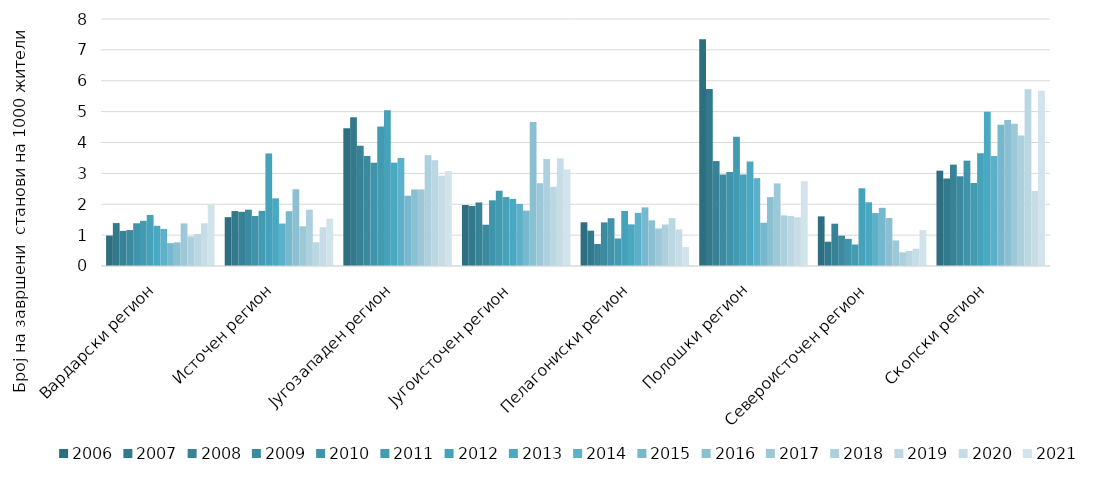
| Category | 2006 | 2007 | 2008 | 2009 | 2010 | 2011 | 2012 | 2013 | 2014 | 2015 | 2016 | 2017 | 2018 | 2019 | 2020 | 2021 |
|---|---|---|---|---|---|---|---|---|---|---|---|---|---|---|---|---|
| Вардарски регион | 0.986 | 1.39 | 1.137 | 1.164 | 1.384 | 1.463 | 1.654 | 1.304 | 1.2 | 0.739 | 0.767 | 1.379 | 0.96 | 1.036 | 1.384 | 1.982 |
| Источен регион | 1.582 | 1.779 | 1.755 | 1.824 | 1.619 | 1.787 | 3.646 | 2.191 | 1.375 | 1.775 | 2.485 | 1.287 | 1.824 | 0.771 | 1.254 | 1.531 |
| Југозападен регион | 4.461 | 4.815 | 3.895 | 3.565 | 3.345 | 4.516 | 5.044 | 3.347 | 3.499 | 2.276 | 2.48 | 2.481 | 3.589 | 3.426 | 2.925 | 3.072 |
| Југоисточен регион | 1.976 | 1.945 | 2.058 | 1.338 | 2.127 | 2.438 | 2.233 | 2.173 | 2.011 | 1.792 | 4.667 | 2.682 | 3.467 | 2.563 | 3.486 | 3.127 |
| Пелагониски регион | 1.416 | 1.144 | 0.712 | 1.413 | 1.547 | 0.892 | 1.784 | 1.348 | 1.719 | 1.898 | 1.478 | 1.214 | 1.343 | 1.552 | 1.184 | 0.613 |
| Полошки регион | 7.341 | 5.729 | 3.398 | 2.963 | 3.044 | 4.186 | 2.964 | 3.385 | 2.845 | 1.402 | 2.232 | 2.674 | 1.641 | 1.617 | 1.58 | 2.747 |
| Североисточен регион | 1.608 | 0.787 | 1.37 | 0.984 | 0.879 | 0.696 | 2.518 | 2.064 | 1.714 | 1.884 | 1.555 | 0.828 | 0.443 | 0.489 | 0.559 | 1.164 |
| Скопски регион | 3.088 | 2.834 | 3.283 | 2.907 | 3.412 | 2.688 | 3.653 | 4.998 | 3.562 | 4.574 | 4.726 | 4.608 | 4.231 | 5.723 | 2.433 | 5.679 |